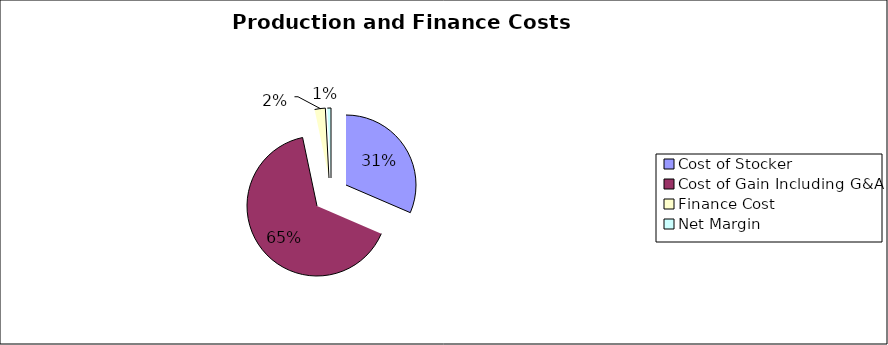
| Category | $/Head |
|---|---|
| Cost of Stocker | 725.152 |
| Cost of Gain Including G&A | 1503.192 |
| Finance Cost | 56.909 |
| Net Margin | 19.172 |